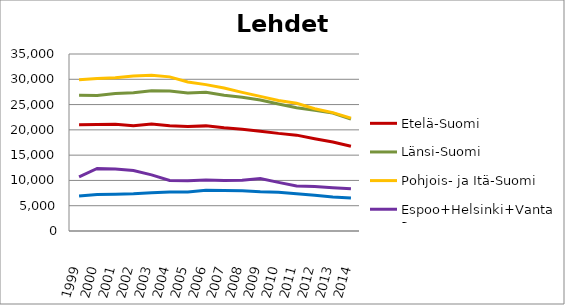
| Category | Etelä-Suomi | Länsi-Suomi | Pohjois- ja Itä-Suomi | Espoo+Helsinki+Vantaa | Muu Uusimaa |
|---|---|---|---|---|---|
| 1999.0 | 20994 | 26835 | 29923 | 10712 | 6935 |
| 2000.0 | 21051 | 26786 | 30155 | 12379 | 7229 |
| 2001.0 | 21106 | 27206 | 30283 | 12255 | 7286 |
| 2002.0 | 20794 | 27361 | 30646 | 11943 | 7383 |
| 2003.0 | 21161 | 27719 | 30816 | 11102 | 7561 |
| 2004.0 | 20797 | 27683 | 30478 | 9989 | 7731 |
| 2005.0 | 20663 | 27284 | 29476 | 9941 | 7716 |
| 2006.0 | 20787 | 27445 | 28948 | 10091 | 8040 |
| 2007.0 | 20411 | 26858 | 28261 | 9989 | 8014 |
| 2008.0 | 20142 | 26458 | 27408 | 10026 | 7963 |
| 2009.0 | 19741 | 25898 | 26626 | 10399 | 7768 |
| 2010.0 | 19304 | 25124 | 25795 | 9619 | 7668 |
| 2011.0 | 18955 | 24374 | 25264 | 8904 | 7357 |
| 2012.0 | 18247 | 23876 | 24163 | 8777 | 7087 |
| 2013.0 | 17608 | 23313 | 23416 | 8531 | 6711 |
| 2014.0 | 16772 | 22125 | 22327 | 8338 | 6541 |